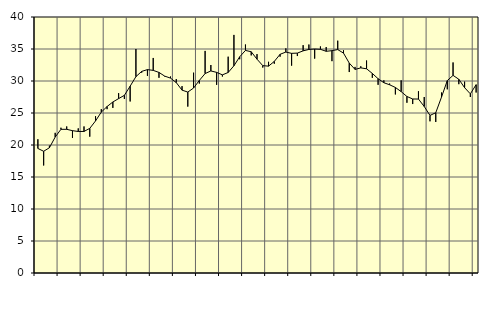
| Category | Piggar | Series 1 |
|---|---|---|
| nan | 20.9 | 19.46 |
| 1.0 | 16.8 | 19.02 |
| 1.0 | 19.9 | 19.57 |
| 1.0 | 21.9 | 21.24 |
| nan | 22.7 | 22.45 |
| 2.0 | 22.9 | 22.45 |
| 2.0 | 21.1 | 22.24 |
| 2.0 | 22.6 | 22.11 |
| nan | 22.9 | 22.12 |
| 3.0 | 21.3 | 22.6 |
| 3.0 | 24.5 | 23.76 |
| 3.0 | 25.6 | 25.14 |
| nan | 25.6 | 26.01 |
| 4.0 | 25.8 | 26.72 |
| 4.0 | 28.1 | 27.25 |
| 4.0 | 27.2 | 27.76 |
| nan | 26.8 | 29.19 |
| 5.0 | 35 | 30.68 |
| 5.0 | 31.3 | 31.5 |
| 5.0 | 30.8 | 31.78 |
| nan | 33.6 | 31.66 |
| 6.0 | 30.5 | 31.34 |
| 6.0 | 30.7 | 30.76 |
| 6.0 | 30.7 | 30.45 |
| nan | 30.3 | 29.75 |
| 7.0 | 29.2 | 28.57 |
| 7.0 | 26 | 28.27 |
| 7.0 | 31.3 | 28.9 |
| nan | 29.6 | 30.09 |
| 8.0 | 34.7 | 31.16 |
| 8.0 | 32.5 | 31.57 |
| 8.0 | 29.4 | 31.35 |
| nan | 30.7 | 30.96 |
| 9.0 | 33.8 | 31.33 |
| 9.0 | 37.2 | 32.38 |
| 9.0 | 33.4 | 33.78 |
| nan | 35.7 | 34.78 |
| 10.0 | 34 | 34.57 |
| 10.0 | 34.2 | 33.41 |
| 10.0 | 32.1 | 32.4 |
| nan | 33 | 32.32 |
| 11.0 | 32.7 | 33.06 |
| 11.0 | 33.8 | 34.17 |
| 11.0 | 35.1 | 34.52 |
| nan | 32.4 | 34.32 |
| 12.0 | 33.9 | 34.36 |
| 12.0 | 35.6 | 34.71 |
| 12.0 | 35.7 | 34.93 |
| nan | 33.5 | 35 |
| 13.0 | 35.4 | 34.95 |
| 13.0 | 35.3 | 34.64 |
| 13.0 | 33.1 | 34.74 |
| nan | 36.3 | 34.91 |
| 14.0 | 34.8 | 34.36 |
| 14.0 | 31.4 | 32.8 |
| 14.0 | 32.2 | 31.81 |
| nan | 32.3 | 32.05 |
| 15.0 | 33.2 | 31.91 |
| 15.0 | 30.5 | 31.18 |
| 15.0 | 29.4 | 30.36 |
| nan | 30.1 | 29.73 |
| 16.0 | 29.6 | 29.41 |
| 16.0 | 27.9 | 28.99 |
| 16.0 | 30.1 | 28.34 |
| nan | 26.6 | 27.58 |
| 17.0 | 26.4 | 27.19 |
| 17.0 | 28.4 | 27.18 |
| 17.0 | 27.5 | 26.02 |
| nan | 23.7 | 24.62 |
| 18.0 | 23.6 | 25.04 |
| 18.0 | 28.2 | 27.49 |
| 18.0 | 28.7 | 30.06 |
| nan | 32.9 | 30.88 |
| 19.0 | 29.5 | 30.27 |
| 19.0 | 29.9 | 28.96 |
| 19.0 | 27.5 | 27.99 |
| nan | 28.2 | 29.43 |